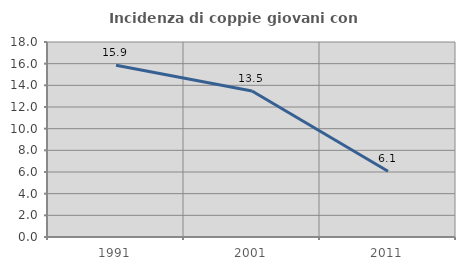
| Category | Incidenza di coppie giovani con figli |
|---|---|
| 1991.0 | 15.856 |
| 2001.0 | 13.474 |
| 2011.0 | 6.066 |